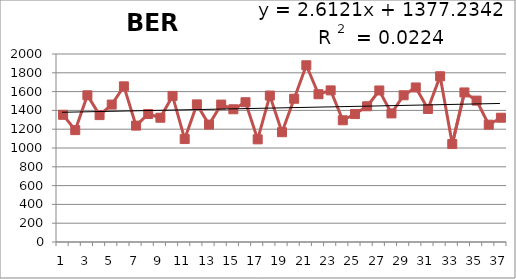
| Category | 1976-2012 |
|---|---|
| 0 | 1353 |
| 1 | 1190 |
| 2 | 1561 |
| 3 | 1350 |
| 4 | 1462 |
| 5 | 1656 |
| 6 | 1238 |
| 7 | 1362 |
| 8 | 1322 |
| 9 | 1554 |
| 10 | 1095 |
| 11 | 1464 |
| 12 | 1249 |
| 13 | 1462 |
| 14 | 1412 |
| 15 | 1487 |
| 16 | 1092 |
| 17 | 1558 |
| 18 | 1168 |
| 19 | 1524 |
| 20 | 1880 |
| 21 | 1572 |
| 22 | 1613 |
| 23 | 1295 |
| 24 | 1361 |
| 25 | 1444 |
| 26 | 1612 |
| 27 | 1368 |
| 28 | 1561 |
| 29 | 1644 |
| 30 | 1415 |
| 31 | 1763 |
| 32 | 1042 |
| 33 | 1591 |
| 34 | 1504 |
| 35 | 1248 |
| 36 | 1322 |